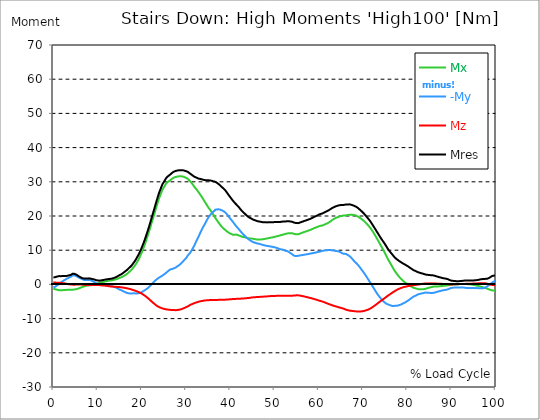
| Category |  Mx |  -My |  Mz |  Mres |
|---|---|---|---|---|
| 0.0 | -1.3 | -0.915 | 0.541 | 2.038 |
| 0.167348456675344 | -1.341 | -0.842 | 0.541 | 2.048 |
| 0.334696913350688 | -1.383 | -0.749 | 0.541 | 2.079 |
| 0.5020453700260321 | -1.445 | -0.593 | 0.509 | 2.173 |
| 0.669393826701376 | -1.508 | -0.437 | 0.509 | 2.235 |
| 0.83674228337672 | -1.56 | -0.281 | 0.509 | 2.308 |
| 1.0040907400520642 | -1.611 | -0.135 | 0.509 | 2.339 |
| 1.1621420602454444 | -1.663 | 0.01 | 0.52 | 2.391 |
| 1.3294905169207885 | -1.705 | 0.177 | 0.499 | 2.433 |
| 1.4968389735961325 | -1.726 | 0.343 | 0.457 | 2.412 |
| 1.6641874302714765 | -1.736 | 0.509 | 0.426 | 2.402 |
| 1.8315358869468206 | -1.726 | 0.676 | 0.405 | 2.402 |
| 1.9988843436221646 | -1.715 | 0.842 | 0.385 | 2.433 |
| 2.1662328002975086 | -1.695 | 0.998 | 0.364 | 2.443 |
| 2.333581256972853 | -1.653 | 1.123 | 0.343 | 2.443 |
| 2.5009297136481967 | -1.622 | 1.227 | 0.302 | 2.464 |
| 2.6682781703235405 | -1.601 | 1.341 | 0.27 | 2.474 |
| 2.8356266269988843 | -1.58 | 1.456 | 0.229 | 2.474 |
| 3.002975083674229 | -1.601 | 1.674 | 0.156 | 2.485 |
| 3.1703235403495724 | -1.591 | 1.747 | 0.125 | 2.537 |
| 3.337671997024917 | -1.58 | 1.83 | 0.083 | 2.578 |
| 3.4957233172182973 | -1.57 | 1.934 | 0.052 | 2.62 |
| 3.663071773893641 | -1.57 | 2.059 | 0.021 | 2.693 |
| 3.8304202305689854 | -1.56 | 2.173 | 0.01 | 2.755 |
| 3.997768687244329 | -1.549 | 2.287 | -0.021 | 2.828 |
| 4.165117143919673 | -1.549 | 2.454 | -0.042 | 2.963 |
| 4.332465600595017 | -1.549 | 2.62 | -0.062 | 3.098 |
| 4.499814057270361 | -1.528 | 2.672 | -0.073 | 3.129 |
| 4.667162513945706 | -1.508 | 2.651 | -0.094 | 3.098 |
| 4.834510970621049 | -1.487 | 2.61 | -0.104 | 3.057 |
| 5.001859427296393 | -1.445 | 2.547 | -0.062 | 2.973 |
| 5.169207883971737 | -1.383 | 2.464 | -0.042 | 2.87 |
| 5.336556340647081 | -1.331 | 2.35 | -0.031 | 2.745 |
| 5.503904797322425 | -1.268 | 2.215 | -0.031 | 2.589 |
| 5.671253253997769 | -1.206 | 2.079 | -0.021 | 2.443 |
| 5.82930457419115 | -1.133 | 1.975 | -0.031 | 2.318 |
| 5.996653030866494 | -1.05 | 1.84 | -0.031 | 2.163 |
| 6.164001487541838 | -0.967 | 1.747 | -0.042 | 2.048 |
| 6.331349944217181 | -0.873 | 1.663 | -0.042 | 1.955 |
| 6.498698400892526 | -0.78 | 1.549 | -0.062 | 1.861 |
| 6.66604685756787 | -0.697 | 1.445 | -0.083 | 1.778 |
| 6.833395314243213 | -0.613 | 1.362 | -0.104 | 1.726 |
| 7.000743770918558 | -0.541 | 1.31 | -0.125 | 1.695 |
| 7.168092227593902 | -0.489 | 1.289 | -0.146 | 1.705 |
| 7.335440684269246 | -0.437 | 1.3 | -0.156 | 1.726 |
| 7.50278914094459 | -0.395 | 1.289 | -0.166 | 1.726 |
| 7.6701375976199335 | -0.343 | 1.279 | -0.177 | 1.726 |
| 7.837486054295278 | -0.312 | 1.3 | -0.177 | 1.747 |
| 7.995537374488658 | -0.291 | 1.31 | -0.177 | 1.767 |
| 8.162885831164003 | -0.281 | 1.289 | -0.156 | 1.747 |
| 8.330234287839346 | -0.26 | 1.248 | -0.156 | 1.715 |
| 8.49758274451469 | -0.239 | 1.185 | -0.156 | 1.663 |
| 8.664931201190035 | -0.198 | 1.081 | -0.146 | 1.611 |
| 8.832279657865378 | -0.146 | 0.988 | -0.135 | 1.539 |
| 8.999628114540721 | -0.094 | 0.873 | -0.146 | 1.508 |
| 9.166976571216066 | -0.052 | 0.749 | -0.156 | 1.476 |
| 9.334325027891412 | 0.01 | 0.624 | -0.156 | 1.414 |
| 9.501673484566755 | 0.073 | 0.489 | -0.146 | 1.31 |
| 9.669021941242098 | 0.125 | 0.374 | -0.156 | 1.227 |
| 9.836370397917442 | 0.198 | 0.26 | -0.156 | 1.196 |
| 10.003718854592787 | 0.26 | 0.135 | -0.177 | 1.175 |
| 10.17106731126813 | 0.333 | 0 | -0.177 | 1.123 |
| 10.329118631461512 | 0.437 | -0.166 | -0.187 | 1.092 |
| 10.496467088136853 | 0.509 | -0.208 | -0.208 | 1.123 |
| 10.663815544812199 | 0.572 | -0.187 | -0.239 | 1.154 |
| 10.831164001487544 | 0.613 | -0.094 | -0.27 | 1.164 |
| 10.998512458162887 | 0.676 | -0.062 | -0.291 | 1.216 |
| 11.16586091483823 | 0.728 | -0.052 | -0.302 | 1.279 |
| 11.333209371513574 | 0.759 | -0.073 | -0.322 | 1.3 |
| 11.50055782818892 | 0.801 | -0.114 | -0.333 | 1.341 |
| 11.667906284864264 | 0.842 | -0.187 | -0.353 | 1.383 |
| 11.835254741539607 | 0.884 | -0.239 | -0.374 | 1.424 |
| 12.00260319821495 | 0.946 | -0.312 | -0.405 | 1.466 |
| 12.169951654890292 | 0.998 | -0.364 | -0.437 | 1.518 |
| 12.337300111565641 | 1.029 | -0.374 | -0.478 | 1.539 |
| 12.504648568240984 | 1.06 | -0.385 | -0.52 | 1.56 |
| 12.662699888434362 | 1.092 | -0.426 | -0.551 | 1.591 |
| 12.830048345109708 | 1.112 | -0.437 | -0.582 | 1.611 |
| 12.997396801785053 | 1.144 | -0.457 | -0.603 | 1.643 |
| 13.164745258460396 | 1.175 | -0.499 | -0.624 | 1.663 |
| 13.33209371513574 | 1.216 | -0.572 | -0.634 | 1.715 |
| 13.499442171811083 | 1.268 | -0.655 | -0.645 | 1.788 |
| 13.666790628486426 | 1.331 | -0.749 | -0.655 | 1.882 |
| 13.834139085161771 | 1.362 | -0.769 | -0.676 | 1.934 |
| 14.001487541837117 | 1.414 | -0.842 | -0.697 | 2.017 |
| 14.16883599851246 | 1.487 | -0.946 | -0.707 | 2.121 |
| 14.336184455187803 | 1.56 | -1.05 | -0.728 | 2.246 |
| 14.503532911863147 | 1.643 | -1.164 | -0.738 | 2.35 |
| 14.670881368538492 | 1.726 | -1.289 | -0.759 | 2.474 |
| 14.828932688731873 | 1.809 | -1.393 | -0.78 | 2.589 |
| 14.996281145407215 | 1.903 | -1.539 | -0.79 | 2.745 |
| 15.163629602082558 | 1.986 | -1.622 | -0.811 | 2.849 |
| 15.330978058757903 | 2.069 | -1.674 | -0.853 | 2.932 |
| 15.498326515433247 | 2.152 | -1.767 | -0.884 | 3.067 |
| 15.665674972108594 | 2.256 | -1.913 | -0.915 | 3.233 |
| 15.833023428783937 | 2.36 | -2.017 | -0.946 | 3.389 |
| 16.00037188545928 | 2.495 | -2.131 | -0.977 | 3.566 |
| 16.167720342134626 | 2.63 | -2.225 | -1.019 | 3.732 |
| 16.335068798809967 | 2.786 | -2.308 | -1.06 | 3.899 |
| 16.502417255485312 | 2.932 | -2.402 | -1.092 | 4.076 |
| 16.669765712160658 | 3.088 | -2.506 | -1.133 | 4.263 |
| 16.837114168836 | 3.265 | -2.547 | -1.185 | 4.439 |
| 17.004462625511344 | 3.473 | -2.599 | -1.248 | 4.658 |
| 17.16251394570472 | 3.68 | -2.641 | -1.3 | 4.866 |
| 17.32986240238007 | 3.868 | -2.672 | -1.362 | 5.063 |
| 17.497210859055414 | 4.055 | -2.682 | -1.424 | 5.271 |
| 17.664559315730756 | 4.273 | -2.651 | -1.487 | 5.489 |
| 17.8319077724061 | 4.512 | -2.578 | -1.56 | 5.749 |
| 17.999256229081443 | 4.772 | -2.61 | -1.632 | 6.041 |
| 18.166604685756788 | 5.053 | -2.662 | -1.695 | 6.352 |
| 18.333953142432133 | 5.323 | -2.62 | -1.757 | 6.644 |
| 18.501301599107478 | 5.614 | -2.61 | -1.84 | 6.966 |
| 18.668650055782823 | 5.957 | -2.63 | -1.923 | 7.33 |
| 18.835998512458165 | 6.321 | -2.63 | -2.007 | 7.704 |
| 19.00334696913351 | 6.675 | -2.63 | -2.09 | 8.089 |
| 19.170695425808855 | 7.059 | -2.61 | -2.183 | 8.473 |
| 19.338043882484197 | 7.486 | -2.537 | -2.277 | 8.9 |
| 19.496095202677576 | 7.943 | -2.516 | -2.381 | 9.336 |
| 19.66344365935292 | 8.411 | -2.454 | -2.485 | 9.804 |
| 19.830792116028263 | 8.91 | -2.35 | -2.599 | 10.282 |
| 19.998140572703612 | 9.409 | -2.225 | -2.724 | 10.802 |
| 20.165489029378953 | 9.929 | -2.09 | -2.87 | 11.343 |
| 20.3328374860543 | 10.49 | -1.996 | -3.005 | 11.894 |
| 20.500185942729644 | 11.073 | -1.851 | -3.15 | 12.476 |
| 20.667534399404985 | 11.655 | -1.705 | -3.296 | 13.069 |
| 20.83488285608033 | 12.279 | -1.56 | -3.452 | 13.682 |
| 21.002231312755672 | 12.934 | -1.424 | -3.618 | 14.327 |
| 21.16957976943102 | 13.62 | -1.279 | -3.795 | 15.003 |
| 21.336928226106362 | 14.285 | -1.092 | -3.972 | 15.668 |
| 21.504276682781704 | 14.951 | -0.905 | -4.159 | 16.333 |
| 21.67162513945705 | 15.626 | -0.707 | -4.335 | 17.02 |
| 21.82967645965043 | 16.344 | -0.509 | -4.523 | 17.737 |
| 21.997024916325774 | 17.061 | -0.27 | -4.731 | 18.475 |
| 22.16437337300112 | 17.778 | -0.031 | -4.928 | 19.224 |
| 22.33172182967646 | 18.475 | 0.187 | -5.136 | 19.941 |
| 22.499070286351806 | 19.192 | 0.426 | -5.323 | 20.679 |
| 22.666418743027148 | 19.91 | 0.645 | -5.5 | 21.417 |
| 22.833767199702496 | 20.627 | 0.863 | -5.677 | 22.156 |
| 23.00111565637784 | 21.355 | 1.071 | -5.864 | 22.904 |
| 23.168464113053183 | 22.083 | 1.279 | -6.051 | 23.673 |
| 23.335812569728528 | 22.821 | 1.445 | -6.207 | 24.412 |
| 23.50316102640387 | 23.517 | 1.611 | -6.332 | 25.108 |
| 23.670509483079215 | 24.204 | 1.778 | -6.467 | 25.805 |
| 23.83785793975456 | 24.9 | 1.944 | -6.592 | 26.491 |
| 23.995909259947936 | 25.534 | 2.069 | -6.685 | 27.125 |
| 24.163257716623285 | 26.054 | 2.194 | -6.779 | 27.645 |
| 24.330606173298627 | 26.626 | 2.318 | -6.862 | 28.206 |
| 24.49795462997397 | 27.208 | 2.443 | -6.945 | 28.778 |
| 24.665303086649313 | 27.739 | 2.568 | -7.028 | 29.308 |
| 24.83265154332466 | 28.092 | 2.734 | -7.08 | 29.652 |
| 25.0 | 28.425 | 2.901 | -7.132 | 29.984 |
| 25.167348456675345 | 28.778 | 3.036 | -7.184 | 30.348 |
| 25.334696913350694 | 29.153 | 3.213 | -7.247 | 30.733 |
| 25.502045370026035 | 29.506 | 3.379 | -7.299 | 31.097 |
| 25.669393826701377 | 29.735 | 3.587 | -7.33 | 31.336 |
| 25.836742283376722 | 29.932 | 3.795 | -7.361 | 31.544 |
| 26.004090740052067 | 30.119 | 3.961 | -7.382 | 31.752 |
| 26.17143919672741 | 30.213 | 4.138 | -7.413 | 31.866 |
| 26.329490516920792 | 30.327 | 4.294 | -7.434 | 32.001 |
| 26.49683897359613 | 30.515 | 4.387 | -7.444 | 32.209 |
| 26.66418743027148 | 30.712 | 4.46 | -7.465 | 32.407 |
| 26.831535886946828 | 30.899 | 4.512 | -7.496 | 32.604 |
| 26.998884343622166 | 31.045 | 4.564 | -7.506 | 32.76 |
| 27.166232800297514 | 31.18 | 4.637 | -7.506 | 32.906 |
| 27.333581256972852 | 31.263 | 4.741 | -7.506 | 32.999 |
| 27.5009297136482 | 31.357 | 4.845 | -7.527 | 33.093 |
| 27.668278170323543 | 31.45 | 4.938 | -7.538 | 33.197 |
| 27.835626626998888 | 31.471 | 5.105 | -7.527 | 33.238 |
| 28.002975083674233 | 31.502 | 5.271 | -7.506 | 33.27 |
| 28.170323540349575 | 31.554 | 5.406 | -7.475 | 33.322 |
| 28.33767199702492 | 31.585 | 5.521 | -7.434 | 33.353 |
| 28.50502045370026 | 31.617 | 5.677 | -7.382 | 33.384 |
| 28.663071773893645 | 31.627 | 5.885 | -7.34 | 33.405 |
| 28.830420230568986 | 31.617 | 6.082 | -7.278 | 33.394 |
| 28.99776868724433 | 31.585 | 6.269 | -7.205 | 33.384 |
| 29.165117143919673 | 31.554 | 6.488 | -7.122 | 33.374 |
| 29.33246560059502 | 31.523 | 6.748 | -7.049 | 33.363 |
| 29.499814057270367 | 31.461 | 6.997 | -6.966 | 33.332 |
| 29.66716251394571 | 31.357 | 7.236 | -6.872 | 33.259 |
| 29.834510970621054 | 31.242 | 7.434 | -6.758 | 33.166 |
| 30.00185942729639 | 31.18 | 7.652 | -6.654 | 33.124 |
| 30.169207883971744 | 31.066 | 7.974 | -6.56 | 33.062 |
| 30.33655634064708 | 30.899 | 8.338 | -6.477 | 32.968 |
| 30.50390479732243 | 30.712 | 8.619 | -6.352 | 32.823 |
| 30.671253253997772 | 30.504 | 8.858 | -6.217 | 32.646 |
| 30.829304574191156 | 30.275 | 9.076 | -6.082 | 32.459 |
| 30.996653030866494 | 30.047 | 9.367 | -5.957 | 32.303 |
| 31.164001487541842 | 29.808 | 9.773 | -5.874 | 32.168 |
| 31.331349944217187 | 29.527 | 10.095 | -5.77 | 31.991 |
| 31.498698400892525 | 29.236 | 10.459 | -5.677 | 31.835 |
| 31.666046857567874 | 28.924 | 10.875 | -5.593 | 31.679 |
| 31.833395314243212 | 28.622 | 11.26 | -5.5 | 31.513 |
| 32.00074377091856 | 28.342 | 11.707 | -5.417 | 31.377 |
| 32.1680922275939 | 28.082 | 12.227 | -5.354 | 31.325 |
| 32.33544068426925 | 27.822 | 12.694 | -5.282 | 31.242 |
| 32.50278914094459 | 27.551 | 13.131 | -5.198 | 31.138 |
| 32.670137597619934 | 27.271 | 13.547 | -5.126 | 31.045 |
| 32.83748605429528 | 26.959 | 13.952 | -5.063 | 30.93 |
| 33.004834510970625 | 26.647 | 14.462 | -4.99 | 30.899 |
| 33.162885831164004 | 26.335 | 14.951 | -4.949 | 30.868 |
| 33.33023428783935 | 26.013 | 15.439 | -4.907 | 30.806 |
| 33.497582744514695 | 25.701 | 15.845 | -4.876 | 30.733 |
| 33.664931201190036 | 25.368 | 16.261 | -4.834 | 30.66 |
| 33.83227965786538 | 25.025 | 16.697 | -4.803 | 30.629 |
| 33.99962811454073 | 24.651 | 17.082 | -4.741 | 30.577 |
| 34.16697657121607 | 24.297 | 17.446 | -4.71 | 30.504 |
| 34.33432502789141 | 23.965 | 17.882 | -4.689 | 30.483 |
| 34.50167348456676 | 23.621 | 18.298 | -4.668 | 30.473 |
| 34.6690219412421 | 23.278 | 18.693 | -4.658 | 30.452 |
| 34.83637039791744 | 22.935 | 19.078 | -4.637 | 30.442 |
| 35.00371885459279 | 22.592 | 19.463 | -4.616 | 30.431 |
| 35.17106731126814 | 22.27 | 19.806 | -4.595 | 30.431 |
| 35.338415767943474 | 21.989 | 20.087 | -4.585 | 30.411 |
| 35.49646708813686 | 21.719 | 20.326 | -4.575 | 30.369 |
| 35.6638155448122 | 21.397 | 20.627 | -4.575 | 30.359 |
| 35.831164001487544 | 21.064 | 20.856 | -4.575 | 30.307 |
| 35.998512458162885 | 20.742 | 21.033 | -4.564 | 30.213 |
| 36.165860914838234 | 20.419 | 21.209 | -4.564 | 30.13 |
| 36.333209371513576 | 20.055 | 21.449 | -4.554 | 30.078 |
| 36.50055782818892 | 19.702 | 21.698 | -4.554 | 30.057 |
| 36.667906284864266 | 19.359 | 21.864 | -4.543 | 29.984 |
| 36.83525474153961 | 19.036 | 21.885 | -4.543 | 29.818 |
| 37.002603198214956 | 18.725 | 21.916 | -4.533 | 29.662 |
| 37.1699516548903 | 18.402 | 21.958 | -4.533 | 29.527 |
| 37.337300111565646 | 18.101 | 21.968 | -4.523 | 29.371 |
| 37.50464856824098 | 17.81 | 21.937 | -4.512 | 29.194 |
| 37.66269988843437 | 17.519 | 21.875 | -4.502 | 28.997 |
| 37.83004834510971 | 17.238 | 21.802 | -4.502 | 28.799 |
| 37.99739680178505 | 16.957 | 21.719 | -4.491 | 28.591 |
| 38.16474525846039 | 16.728 | 21.594 | -4.481 | 28.383 |
| 38.33209371513574 | 16.5 | 21.49 | -4.481 | 28.175 |
| 38.49944217181109 | 16.302 | 21.397 | -4.481 | 28.019 |
| 38.666790628486424 | 16.136 | 21.272 | -4.471 | 27.822 |
| 38.83413908516178 | 15.969 | 21.074 | -4.46 | 27.583 |
| 39.001487541837115 | 15.772 | 20.866 | -4.45 | 27.312 |
| 39.16883599851246 | 15.595 | 20.596 | -4.439 | 26.99 |
| 39.336184455187805 | 15.408 | 20.357 | -4.419 | 26.689 |
| 39.503532911863154 | 15.242 | 20.087 | -4.408 | 26.387 |
| 39.670881368538495 | 15.117 | 19.785 | -4.387 | 26.065 |
| 39.83822982521384 | 15.003 | 19.515 | -4.367 | 25.784 |
| 39.996281145407224 | 14.888 | 19.234 | -4.346 | 25.493 |
| 40.163629602082565 | 14.784 | 18.964 | -4.335 | 25.202 |
| 40.33097805875791 | 14.68 | 18.693 | -4.315 | 24.921 |
| 40.498326515433256 | 14.576 | 18.444 | -4.294 | 24.651 |
| 40.6656749721086 | 14.493 | 18.174 | -4.283 | 24.37 |
| 40.83302342878393 | 14.462 | 17.924 | -4.263 | 24.131 |
| 41.00037188545929 | 14.535 | 17.591 | -4.252 | 23.871 |
| 41.16772034213463 | 14.566 | 17.29 | -4.242 | 23.632 |
| 41.33506879880997 | 14.576 | 17.009 | -4.231 | 23.414 |
| 41.50241725548531 | 14.483 | 16.791 | -4.221 | 23.174 |
| 41.66976571216066 | 14.441 | 16.562 | -4.211 | 22.977 |
| 41.837114168836 | 14.368 | 16.302 | -4.211 | 22.717 |
| 42.004462625511344 | 14.296 | 16.042 | -4.2 | 22.467 |
| 42.17181108218669 | 14.212 | 15.772 | -4.19 | 22.208 |
| 42.32986240238007 | 14.119 | 15.502 | -4.169 | 21.937 |
| 42.497210859055414 | 14.025 | 15.242 | -4.159 | 21.667 |
| 42.66455931573076 | 13.932 | 15.013 | -4.128 | 21.428 |
| 42.831907772406105 | 13.88 | 14.774 | -4.117 | 21.199 |
| 42.999256229081446 | 13.848 | 14.555 | -4.107 | 21.012 |
| 43.16660468575679 | 13.828 | 14.327 | -4.086 | 20.814 |
| 43.33395314243214 | 13.776 | 14.119 | -4.076 | 20.617 |
| 43.50130159910748 | 13.693 | 13.911 | -4.055 | 20.398 |
| 43.66865005578282 | 13.62 | 13.724 | -4.034 | 20.201 |
| 43.83599851245817 | 13.537 | 13.537 | -4.013 | 20.003 |
| 44.00334696913351 | 13.485 | 13.349 | -3.982 | 19.827 |
| 44.17069542580886 | 13.443 | 13.183 | -3.972 | 19.66 |
| 44.3380438824842 | 13.443 | 13.038 | -3.94 | 19.546 |
| 44.49609520267758 | 13.443 | 12.892 | -3.899 | 19.442 |
| 44.66344365935292 | 13.433 | 12.746 | -3.868 | 19.317 |
| 44.83079211602827 | 13.401 | 12.601 | -3.836 | 19.192 |
| 44.99814057270361 | 13.381 | 12.476 | -3.805 | 19.068 |
| 45.16548902937895 | 13.339 | 12.372 | -3.784 | 18.974 |
| 45.332837486054295 | 13.297 | 12.279 | -3.764 | 18.87 |
| 45.500185942729644 | 13.256 | 12.227 | -3.743 | 18.797 |
| 45.66753439940499 | 13.214 | 12.175 | -3.732 | 18.725 |
| 45.83488285608033 | 13.173 | 12.081 | -3.722 | 18.621 |
| 46.00223131275568 | 13.131 | 12.029 | -3.701 | 18.548 |
| 46.16957976943102 | 13.11 | 11.967 | -3.691 | 18.485 |
| 46.336928226106366 | 13.121 | 11.915 | -3.68 | 18.433 |
| 46.50427668278171 | 13.121 | 11.873 | -3.66 | 18.392 |
| 46.671625139457056 | 13.121 | 11.821 | -3.649 | 18.361 |
| 46.829676459650436 | 13.131 | 11.769 | -3.628 | 18.319 |
| 46.99702491632577 | 13.152 | 11.696 | -3.618 | 18.278 |
| 47.16437337300112 | 13.173 | 11.624 | -3.608 | 18.236 |
| 47.33172182967646 | 13.194 | 11.551 | -3.587 | 18.194 |
| 47.49907028635181 | 13.214 | 11.488 | -3.576 | 18.153 |
| 47.66641874302716 | 13.266 | 11.447 | -3.566 | 18.153 |
| 47.83376719970249 | 13.308 | 11.395 | -3.556 | 18.153 |
| 48.001115656377834 | 13.349 | 11.343 | -3.535 | 18.142 |
| 48.16846411305319 | 13.381 | 11.291 | -3.525 | 18.132 |
| 48.33581256972853 | 13.433 | 11.239 | -3.504 | 18.132 |
| 48.50316102640387 | 13.485 | 11.208 | -3.483 | 18.142 |
| 48.67050948307921 | 13.526 | 11.187 | -3.462 | 18.153 |
| 48.837857939754564 | 13.578 | 11.145 | -3.452 | 18.174 |
| 49.005206396429905 | 13.63 | 11.125 | -3.431 | 18.184 |
| 49.163257716623285 | 13.661 | 11.083 | -3.41 | 18.184 |
| 49.33060617329863 | 13.703 | 11.041 | -3.4 | 18.184 |
| 49.49795462997397 | 13.745 | 10.989 | -3.379 | 18.184 |
| 49.66530308664932 | 13.797 | 10.948 | -3.369 | 18.194 |
| 49.832651543324666 | 13.838 | 10.896 | -3.369 | 18.205 |
| 50.0 | 13.89 | 10.844 | -3.358 | 18.215 |
| 50.16734845667534 | 13.952 | 10.813 | -3.358 | 18.246 |
| 50.33469691335069 | 14.015 | 10.781 | -3.358 | 18.278 |
| 50.50204537002604 | 14.067 | 10.688 | -3.327 | 18.257 |
| 50.66939382670139 | 14.119 | 10.605 | -3.317 | 18.246 |
| 50.836742283376715 | 14.16 | 10.501 | -3.285 | 18.226 |
| 51.00409074005207 | 14.223 | 10.438 | -3.285 | 18.257 |
| 51.17143919672741 | 14.285 | 10.355 | -3.285 | 18.246 |
| 51.32949051692079 | 14.348 | 10.293 | -3.285 | 18.267 |
| 51.496838973596134 | 14.41 | 10.241 | -3.296 | 18.298 |
| 51.66418743027148 | 14.462 | 10.22 | -3.306 | 18.34 |
| 51.831535886946824 | 14.524 | 10.178 | -3.306 | 18.361 |
| 51.99888434362217 | 14.587 | 10.116 | -3.306 | 18.381 |
| 52.16623280029752 | 14.639 | 10.012 | -3.306 | 18.381 |
| 52.33358125697285 | 14.701 | 9.898 | -3.285 | 18.361 |
| 52.5009297136482 | 14.763 | 9.804 | -3.285 | 18.371 |
| 52.668278170323546 | 14.826 | 9.783 | -3.296 | 18.433 |
| 52.835626626998895 | 14.878 | 9.752 | -3.317 | 18.475 |
| 53.00297508367424 | 14.919 | 9.679 | -3.337 | 18.485 |
| 53.17032354034958 | 14.94 | 9.555 | -3.348 | 18.465 |
| 53.33767199702492 | 14.961 | 9.419 | -3.348 | 18.444 |
| 53.50502045370027 | 14.982 | 9.243 | -3.337 | 18.413 |
| 53.663071773893655 | 14.992 | 9.108 | -3.337 | 18.392 |
| 53.83042023056899 | 14.992 | 8.962 | -3.327 | 18.361 |
| 53.99776868724433 | 14.971 | 8.796 | -3.306 | 18.309 |
| 54.16511714391967 | 14.888 | 8.619 | -3.285 | 18.205 |
| 54.33246560059503 | 14.795 | 8.463 | -3.265 | 18.111 |
| 54.49981405727037 | 14.743 | 8.359 | -3.265 | 18.038 |
| 54.667162513945705 | 14.701 | 8.307 | -3.244 | 17.997 |
| 54.834510970621054 | 14.67 | 8.297 | -3.213 | 17.966 |
| 55.0018594272964 | 14.628 | 8.317 | -3.192 | 17.924 |
| 55.169207883971744 | 14.628 | 8.328 | -3.192 | 17.903 |
| 55.336556340647086 | 14.659 | 8.38 | -3.202 | 17.914 |
| 55.50390479732243 | 14.722 | 8.411 | -3.233 | 17.966 |
| 55.671253253997776 | 14.795 | 8.463 | -3.254 | 18.028 |
| 55.83860171067312 | 14.878 | 8.473 | -3.296 | 18.111 |
| 55.9966530308665 | 14.982 | 8.515 | -3.337 | 18.215 |
| 56.16400148754184 | 15.065 | 8.557 | -3.379 | 18.298 |
| 56.33134994421718 | 15.138 | 8.598 | -3.421 | 18.35 |
| 56.498698400892536 | 15.21 | 8.629 | -3.473 | 18.423 |
| 56.66604685756788 | 15.294 | 8.671 | -3.514 | 18.506 |
| 56.83339531424321 | 15.366 | 8.702 | -3.566 | 18.579 |
| 57.00074377091856 | 15.439 | 8.744 | -3.618 | 18.662 |
| 57.16809222759391 | 15.512 | 8.785 | -3.67 | 18.735 |
| 57.33544068426925 | 15.585 | 8.796 | -3.722 | 18.808 |
| 57.5027891409446 | 15.668 | 8.837 | -3.784 | 18.891 |
| 57.670137597619934 | 15.741 | 8.868 | -3.836 | 18.964 |
| 57.83748605429528 | 15.813 | 8.92 | -3.878 | 19.036 |
| 58.004834510970625 | 15.876 | 8.993 | -3.93 | 19.12 |
| 58.16288583116401 | 15.969 | 9.035 | -3.982 | 19.224 |
| 58.330234287839346 | 16.063 | 9.066 | -4.034 | 19.317 |
| 58.497582744514695 | 16.157 | 9.097 | -4.096 | 19.411 |
| 58.66493120119004 | 16.261 | 9.128 | -4.169 | 19.525 |
| 58.832279657865385 | 16.365 | 9.18 | -4.231 | 19.629 |
| 58.999628114540734 | 16.458 | 9.222 | -4.294 | 19.743 |
| 59.16697657121607 | 16.552 | 9.274 | -4.367 | 19.858 |
| 59.33432502789142 | 16.624 | 9.326 | -4.419 | 19.951 |
| 59.50167348456676 | 16.708 | 9.378 | -4.471 | 20.045 |
| 59.66902194124211 | 16.791 | 9.43 | -4.543 | 20.149 |
| 59.83637039791745 | 16.884 | 9.492 | -4.627 | 20.274 |
| 60.00371885459278 | 16.978 | 9.544 | -4.71 | 20.388 |
| 60.17106731126813 | 17.082 | 9.575 | -4.783 | 20.502 |
| 60.33841576794349 | 17.123 | 9.617 | -4.834 | 20.565 |
| 60.49646708813685 | 17.155 | 9.669 | -4.886 | 20.617 |
| 60.6638155448122 | 17.186 | 9.742 | -4.938 | 20.669 |
| 60.831164001487544 | 17.227 | 9.804 | -5.011 | 20.752 |
| 60.99851245816289 | 17.311 | 9.846 | -5.084 | 20.846 |
| 61.16586091483824 | 17.404 | 9.898 | -5.178 | 20.97 |
| 61.333209371513576 | 17.508 | 9.929 | -5.261 | 21.085 |
| 61.50055782818892 | 17.612 | 9.95 | -5.344 | 21.189 |
| 61.667906284864266 | 17.706 | 9.971 | -5.438 | 21.293 |
| 61.835254741539615 | 17.799 | 9.991 | -5.521 | 21.386 |
| 62.002603198214956 | 17.893 | 10.012 | -5.604 | 21.49 |
| 62.16995165489029 | 18.007 | 10.033 | -5.687 | 21.604 |
| 62.33730011156564 | 18.132 | 10.043 | -5.77 | 21.74 |
| 62.504648568240995 | 18.267 | 10.054 | -5.853 | 21.875 |
| 62.67199702491633 | 18.433 | 10.043 | -5.926 | 22.02 |
| 62.83004834510971 | 18.61 | 10.012 | -6.009 | 22.166 |
| 62.99739680178505 | 18.777 | 9.991 | -6.082 | 22.301 |
| 63.1647452584604 | 18.922 | 9.939 | -6.155 | 22.415 |
| 63.33209371513575 | 19.068 | 9.898 | -6.228 | 22.53 |
| 63.4994421718111 | 19.192 | 9.856 | -6.29 | 22.634 |
| 63.666790628486424 | 19.307 | 9.825 | -6.363 | 22.727 |
| 63.83413908516177 | 19.421 | 9.783 | -6.425 | 22.811 |
| 64.00148754183712 | 19.515 | 9.763 | -6.488 | 22.894 |
| 64.16883599851248 | 19.608 | 9.721 | -6.56 | 22.966 |
| 64.3361844551878 | 19.681 | 9.7 | -6.623 | 23.039 |
| 64.50353291186315 | 19.764 | 9.648 | -6.685 | 23.091 |
| 64.6708813685385 | 19.837 | 9.565 | -6.748 | 23.143 |
| 64.83822982521384 | 19.91 | 9.461 | -6.799 | 23.174 |
| 65.00557828188919 | 19.983 | 9.347 | -6.862 | 23.195 |
| 65.16362960208257 | 20.045 | 9.222 | -6.914 | 23.206 |
| 65.3309780587579 | 20.076 | 9.118 | -6.976 | 23.216 |
| 65.49832651543326 | 20.118 | 9.004 | -7.039 | 23.226 |
| 65.6656749721086 | 20.139 | 8.952 | -7.111 | 23.247 |
| 65.83302342878395 | 20.139 | 8.931 | -7.205 | 23.268 |
| 66.00037188545929 | 20.149 | 8.931 | -7.309 | 23.32 |
| 66.16772034213463 | 20.18 | 8.92 | -7.413 | 23.372 |
| 66.33506879880998 | 20.232 | 8.796 | -7.465 | 23.393 |
| 66.50241725548531 | 20.284 | 8.65 | -7.527 | 23.403 |
| 66.66976571216065 | 20.315 | 8.494 | -7.558 | 23.393 |
| 66.83711416883601 | 20.336 | 8.39 | -7.621 | 23.393 |
| 67.00446262551135 | 20.357 | 8.286 | -7.683 | 23.403 |
| 67.1718110821867 | 20.378 | 8.037 | -7.704 | 23.341 |
| 67.32986240238007 | 20.388 | 7.787 | -7.714 | 23.289 |
| 67.49721085905541 | 20.367 | 7.6 | -7.756 | 23.226 |
| 67.66455931573076 | 20.336 | 7.371 | -7.798 | 23.154 |
| 67.83190777240611 | 20.315 | 7.08 | -7.798 | 23.06 |
| 67.99925622908145 | 20.284 | 6.82 | -7.818 | 22.977 |
| 68.16660468575678 | 20.243 | 6.602 | -7.839 | 22.883 |
| 68.33395314243214 | 20.18 | 6.394 | -7.87 | 22.79 |
| 68.50130159910749 | 20.076 | 6.207 | -7.891 | 22.665 |
| 68.66865005578282 | 19.972 | 5.999 | -7.912 | 22.53 |
| 68.83599851245816 | 19.858 | 5.749 | -7.933 | 22.374 |
| 69.00334696913352 | 19.733 | 5.489 | -7.943 | 22.197 |
| 69.17069542580886 | 19.588 | 5.23 | -7.943 | 22.01 |
| 69.3380438824842 | 19.432 | 4.97 | -7.933 | 21.812 |
| 69.50539233915956 | 19.296 | 4.647 | -7.902 | 21.636 |
| 69.66344365935292 | 19.14 | 4.346 | -7.87 | 21.428 |
| 69.83079211602826 | 18.974 | 4.065 | -7.85 | 21.22 |
| 69.99814057270362 | 18.787 | 3.784 | -7.818 | 21.012 |
| 70.16548902937896 | 18.61 | 3.473 | -7.766 | 20.783 |
| 70.33283748605429 | 18.423 | 3.15 | -7.714 | 20.554 |
| 70.50018594272964 | 18.226 | 2.838 | -7.673 | 20.315 |
| 70.667534399405 | 17.986 | 2.526 | -7.6 | 20.045 |
| 70.83488285608033 | 17.747 | 2.183 | -7.538 | 19.785 |
| 71.00223131275568 | 17.519 | 1.851 | -7.454 | 19.525 |
| 71.16957976943102 | 17.269 | 1.518 | -7.371 | 19.265 |
| 71.33692822610637 | 17.03 | 1.164 | -7.267 | 19.005 |
| 71.50427668278171 | 16.791 | 0.842 | -7.174 | 18.756 |
| 71.67162513945706 | 16.5 | 0.499 | -7.059 | 18.454 |
| 71.8389735961324 | 16.188 | 0.156 | -6.924 | 18.111 |
| 71.99702491632577 | 15.876 | -0.187 | -6.789 | 17.758 |
| 72.16437337300113 | 15.574 | -0.541 | -6.654 | 17.446 |
| 72.33172182967647 | 15.231 | -0.884 | -6.498 | 17.092 |
| 72.49907028635181 | 14.888 | -1.227 | -6.352 | 16.76 |
| 72.66641874302715 | 14.524 | -1.58 | -6.186 | 16.416 |
| 72.8337671997025 | 14.15 | -1.934 | -6.03 | 16.084 |
| 73.00111565637783 | 13.776 | -2.266 | -5.874 | 15.73 |
| 73.16846411305319 | 13.401 | -2.61 | -5.697 | 15.366 |
| 73.33581256972853 | 13.038 | -2.932 | -5.531 | 15.023 |
| 73.50316102640387 | 12.653 | -3.223 | -5.365 | 14.691 |
| 73.67050948307921 | 12.258 | -3.504 | -5.198 | 14.327 |
| 73.83785793975457 | 11.873 | -3.795 | -5.032 | 13.973 |
| 74.00520639642991 | 11.457 | -4.065 | -4.876 | 13.641 |
| 74.16325771662328 | 11.062 | -4.346 | -4.71 | 13.308 |
| 74.33060617329863 | 10.677 | -4.575 | -4.543 | 13.006 |
| 74.49795462997398 | 10.293 | -4.814 | -4.387 | 12.684 |
| 74.66530308664932 | 9.877 | -4.99 | -4.252 | 12.383 |
| 74.83265154332466 | 9.482 | -5.167 | -4.096 | 12.05 |
| 75.00000000000001 | 9.076 | -5.375 | -3.93 | 11.728 |
| 75.16734845667534 | 8.661 | -5.531 | -3.764 | 11.384 |
| 75.3346969133507 | 8.224 | -5.677 | -3.597 | 11.041 |
| 75.50204537002605 | 7.777 | -5.77 | -3.441 | 10.657 |
| 75.66939382670138 | 7.361 | -5.853 | -3.285 | 10.324 |
| 75.83674228337672 | 6.966 | -5.916 | -3.129 | 10.012 |
| 76.00409074005208 | 6.592 | -5.999 | -2.984 | 9.752 |
| 76.17143919672742 | 6.228 | -6.093 | -2.838 | 9.492 |
| 76.33878765340276 | 5.843 | -6.186 | -2.693 | 9.232 |
| 76.49683897359614 | 5.458 | -6.248 | -2.537 | 8.962 |
| 76.66418743027148 | 5.084 | -6.3 | -2.391 | 8.692 |
| 76.83153588694682 | 4.699 | -6.321 | -2.256 | 8.442 |
| 76.99888434362218 | 4.335 | -6.29 | -2.121 | 8.172 |
| 77.16623280029752 | 3.982 | -6.269 | -1.986 | 7.912 |
| 77.33358125697285 | 3.66 | -6.238 | -1.851 | 7.683 |
| 77.5009297136482 | 3.369 | -6.228 | -1.726 | 7.506 |
| 77.66827817032356 | 3.088 | -6.238 | -1.601 | 7.361 |
| 77.83562662699889 | 2.807 | -6.207 | -1.487 | 7.205 |
| 78.00297508367423 | 2.526 | -6.134 | -1.383 | 7.018 |
| 78.17032354034959 | 2.256 | -6.072 | -1.289 | 6.841 |
| 78.33767199702493 | 2.017 | -5.999 | -1.196 | 6.706 |
| 78.50502045370027 | 1.788 | -5.937 | -1.102 | 6.581 |
| 78.67236891037561 | 1.56 | -5.853 | -1.019 | 6.456 |
| 78.83042023056899 | 1.331 | -5.749 | -0.946 | 6.3 |
| 78.99776868724433 | 1.123 | -5.635 | -0.873 | 6.155 |
| 79.16511714391969 | 0.925 | -5.521 | -0.801 | 6.02 |
| 79.33246560059503 | 0.749 | -5.406 | -0.738 | 5.905 |
| 79.49981405727036 | 0.572 | -5.292 | -0.697 | 5.812 |
| 79.66716251394571 | 0.405 | -5.167 | -0.655 | 5.687 |
| 79.83451097062107 | 0.239 | -5.022 | -0.603 | 5.531 |
| 80.00185942729641 | 0.104 | -4.897 | -0.551 | 5.406 |
| 80.16920788397174 | -0.021 | -4.772 | -0.509 | 5.302 |
| 80.33655634064709 | -0.156 | -4.627 | -0.468 | 5.157 |
| 80.50390479732243 | -0.302 | -4.439 | -0.426 | 4.98 |
| 80.67125325399778 | -0.437 | -4.273 | -0.395 | 4.814 |
| 80.83860171067312 | -0.551 | -4.128 | -0.353 | 4.679 |
| 80.99665303086651 | -0.686 | -3.982 | -0.322 | 4.533 |
| 81.16400148754184 | -0.811 | -3.826 | -0.291 | 4.398 |
| 81.3313499442172 | -0.925 | -3.66 | -0.26 | 4.242 |
| 81.49869840089255 | -1.008 | -3.525 | -0.229 | 4.107 |
| 81.66604685756786 | -1.071 | -3.431 | -0.198 | 4.024 |
| 81.83339531424322 | -1.112 | -3.369 | -0.156 | 3.972 |
| 82.00074377091858 | -1.196 | -3.244 | -0.125 | 3.868 |
| 82.16809222759392 | -1.279 | -3.098 | -0.094 | 3.743 |
| 82.33544068426926 | -1.352 | -2.984 | -0.073 | 3.639 |
| 82.50278914094459 | -1.404 | -2.89 | -0.042 | 3.545 |
| 82.67013759761994 | -1.404 | -2.828 | 0 | 3.473 |
| 82.83748605429528 | -1.393 | -2.776 | 0.031 | 3.4 |
| 83.00483451097062 | -1.404 | -2.724 | 0.073 | 3.337 |
| 83.17218296764597 | -1.414 | -2.662 | 0.104 | 3.275 |
| 83.33023428783935 | -1.424 | -2.62 | 0.146 | 3.223 |
| 83.4975827445147 | -1.414 | -2.589 | 0.177 | 3.171 |
| 83.66493120119004 | -1.393 | -2.537 | 0.208 | 3.098 |
| 83.83227965786537 | -1.372 | -2.464 | 0.218 | 3.015 |
| 83.99962811454073 | -1.341 | -2.412 | 0.239 | 2.932 |
| 84.16697657121607 | -1.289 | -2.381 | 0.25 | 2.88 |
| 84.33432502789142 | -1.227 | -2.391 | 0.26 | 2.849 |
| 84.50167348456677 | -1.154 | -2.433 | 0.27 | 2.818 |
| 84.6690219412421 | -1.081 | -2.464 | 0.281 | 2.797 |
| 84.83637039791745 | -1.029 | -2.464 | 0.281 | 2.766 |
| 85.0037188545928 | -0.946 | -2.464 | 0.281 | 2.724 |
| 85.17106731126813 | -0.894 | -2.474 | 0.291 | 2.714 |
| 85.33841576794349 | -0.832 | -2.495 | 0.302 | 2.703 |
| 85.50576422461883 | -0.78 | -2.495 | 0.291 | 2.693 |
| 85.66381554481221 | -0.728 | -2.495 | 0.291 | 2.672 |
| 85.83116400148755 | -0.676 | -2.485 | 0.291 | 2.641 |
| 85.99851245816289 | -0.655 | -2.454 | 0.281 | 2.599 |
| 86.16586091483823 | -0.634 | -2.412 | 0.26 | 2.547 |
| 86.33320937151358 | -0.634 | -2.35 | 0.26 | 2.485 |
| 86.50055782818893 | -0.634 | -2.277 | 0.239 | 2.412 |
| 86.66790628486427 | -0.624 | -2.215 | 0.229 | 2.339 |
| 86.83525474153961 | -0.613 | -2.142 | 0.218 | 2.277 |
| 87.00260319821496 | -0.593 | -2.079 | 0.198 | 2.204 |
| 87.16995165489031 | -0.572 | -2.017 | 0.187 | 2.142 |
| 87.33730011156564 | -0.541 | -1.975 | 0.187 | 2.09 |
| 87.504648568241 | -0.509 | -1.923 | 0.177 | 2.038 |
| 87.67199702491634 | -0.489 | -1.871 | 0.166 | 1.975 |
| 87.83004834510972 | -0.457 | -1.809 | 0.156 | 1.913 |
| 87.99739680178506 | -0.437 | -1.757 | 0.146 | 1.861 |
| 88.1647452584604 | -0.416 | -1.705 | 0.135 | 1.809 |
| 88.33209371513574 | -0.385 | -1.663 | 0.135 | 1.767 |
| 88.49944217181108 | -0.374 | -1.643 | 0.135 | 1.736 |
| 88.66679062848644 | -0.353 | -1.611 | 0.135 | 1.705 |
| 88.83413908516178 | -0.333 | -1.58 | 0.125 | 1.663 |
| 89.00148754183712 | -0.312 | -1.528 | 0.125 | 1.611 |
| 89.16883599851246 | -0.26 | -1.456 | 0.094 | 1.528 |
| 89.33618445518782 | -0.198 | -1.372 | 0.062 | 1.435 |
| 89.50353291186315 | -0.156 | -1.279 | 0.021 | 1.331 |
| 89.6708813685385 | -0.125 | -1.185 | 0 | 1.237 |
| 89.83822982521386 | -0.094 | -1.102 | -0.01 | 1.154 |
| 90.00557828188919 | -0.073 | -1.04 | -0.01 | 1.102 |
| 90.16362960208257 | -0.062 | -0.998 | 0 | 1.06 |
| 90.3309780587579 | -0.062 | -0.967 | 0.01 | 1.04 |
| 90.49832651543326 | -0.042 | -0.946 | 0.021 | 1.019 |
| 90.66567497210859 | -0.021 | -0.925 | 0.021 | 0.988 |
| 90.83302342878395 | -0.01 | -0.905 | 0.031 | 0.967 |
| 91.00037188545929 | 0 | -0.894 | 0.042 | 0.957 |
| 91.16772034213463 | 0.021 | -0.884 | 0.052 | 0.946 |
| 91.33506879880998 | 0.042 | -0.884 | 0.062 | 0.946 |
| 91.50241725548533 | 0.052 | -0.894 | 0.073 | 0.946 |
| 91.66976571216065 | 0.073 | -0.884 | 0.083 | 0.946 |
| 91.83711416883601 | 0.083 | -0.894 | 0.094 | 0.957 |
| 92.00446262551137 | 0.094 | -0.894 | 0.104 | 0.977 |
| 92.1718110821867 | 0.114 | -0.884 | 0.114 | 0.998 |
| 92.33915953886203 | 0.135 | -0.884 | 0.114 | 1.019 |
| 92.49721085905541 | 0.146 | -0.884 | 0.125 | 1.04 |
| 92.66455931573077 | 0.146 | -0.905 | 0.135 | 1.071 |
| 92.83190777240611 | 0.135 | -0.936 | 0.135 | 1.092 |
| 92.99925622908145 | 0.125 | -0.967 | 0.146 | 1.112 |
| 93.1666046857568 | 0.094 | -0.998 | 0.166 | 1.133 |
| 93.33395314243214 | 0.094 | -1.019 | 0.166 | 1.144 |
| 93.50130159910749 | 0.094 | -1.029 | 0.166 | 1.144 |
| 93.66865005578283 | 0.073 | -1.05 | 0.177 | 1.154 |
| 93.83599851245818 | 0.073 | -1.05 | 0.187 | 1.144 |
| 94.00334696913353 | 0.042 | -1.081 | 0.198 | 1.144 |
| 94.17069542580886 | 0.01 | -1.092 | 0.208 | 1.144 |
| 94.3380438824842 | -0.021 | -1.092 | 0.218 | 1.144 |
| 94.50539233915954 | -0.042 | -1.071 | 0.218 | 1.133 |
| 94.66344365935292 | -0.073 | -1.05 | 0.218 | 1.112 |
| 94.83079211602828 | -0.114 | -1.05 | 0.229 | 1.112 |
| 94.99814057270362 | -0.156 | -1.05 | 0.239 | 1.133 |
| 95.16548902937897 | -0.198 | -1.081 | 0.26 | 1.175 |
| 95.33283748605432 | -0.239 | -1.102 | 0.27 | 1.206 |
| 95.50018594272963 | -0.281 | -1.092 | 0.27 | 1.206 |
| 95.66753439940499 | -0.322 | -1.071 | 0.27 | 1.216 |
| 95.83488285608034 | -0.374 | -1.102 | 0.291 | 1.268 |
| 96.00223131275567 | -0.426 | -1.092 | 0.302 | 1.289 |
| 96.16957976943102 | -0.489 | -1.102 | 0.312 | 1.341 |
| 96.33692822610638 | -0.541 | -1.144 | 0.322 | 1.414 |
| 96.50427668278171 | -0.603 | -1.154 | 0.333 | 1.466 |
| 96.67162513945706 | -0.655 | -1.112 | 0.333 | 1.476 |
| 96.8389735961324 | -0.728 | -1.123 | 0.343 | 1.518 |
| 96.99702491632577 | -0.811 | -1.144 | 0.364 | 1.57 |
| 97.16437337300111 | -0.873 | -1.102 | 0.364 | 1.601 |
| 97.33172182967647 | -0.946 | -1.04 | 0.353 | 1.601 |
| 97.49907028635181 | -1.008 | -0.967 | 0.343 | 1.601 |
| 97.66641874302715 | -1.071 | -0.884 | 0.322 | 1.611 |
| 97.8337671997025 | -1.133 | -0.78 | 0.281 | 1.632 |
| 98.00111565637785 | -1.196 | -0.665 | 0.239 | 1.643 |
| 98.16846411305319 | -1.279 | -0.53 | 0.187 | 1.684 |
| 98.33581256972855 | -1.362 | -0.364 | 0.114 | 1.767 |
| 98.50316102640389 | -1.456 | -0.218 | 0.042 | 1.882 |
| 98.67050948307921 | -1.539 | -0.062 | -0.01 | 1.975 |
| 98.83785793975456 | -1.611 | 0.125 | -0.062 | 2.131 |
| 99.0052063964299 | -1.674 | 0.302 | -0.114 | 2.287 |
| 99.17255485310525 | -1.736 | 0.489 | -0.156 | 2.433 |
| 99.33060617329863 | -1.757 | 0.624 | -0.177 | 2.506 |
| 99.49795462997399 | -1.788 | 0.749 | -0.208 | 2.547 |
| 99.66530308664933 | -1.819 | 0.873 | -0.229 | 2.578 |
| 99.83265154332467 | -1.84 | 0.998 | -0.25 | 2.61 |
| 100.0 | -1.871 | 1.123 | -0.281 | 2.651 |